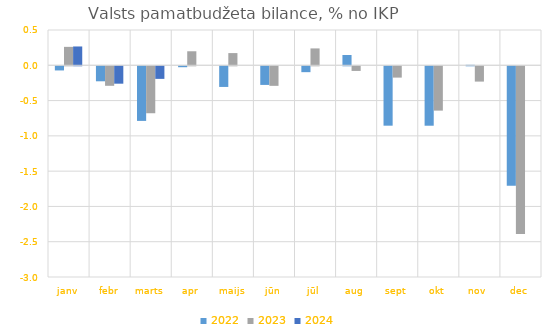
| Category | 2022 | 2023 | 2024 |
|---|---|---|---|
| janv | -0.059 | 0.261 | 0.267 |
| febr | -0.213 | -0.277 | -0.247 |
| marts | -0.774 | -0.665 | -0.178 |
| apr | -0.013 | 0.199 | 0 |
| maijs | -0.293 | 0.173 | 0 |
| jūn | -0.264 | -0.277 | 0 |
| jūl | -0.083 | 0.239 | 0 |
| aug | 0.146 | -0.066 | 0 |
| sept | -0.842 | -0.16 | 0 |
| okt | -0.842 | -0.628 | 0 |
| nov | 0.007 | -0.217 | 0 |
| dec | -1.692 | -2.376 | 0 |